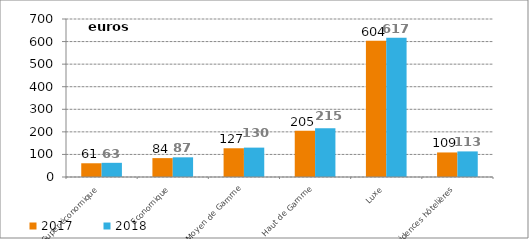
| Category | 2017 | 2018 |
|---|---|---|
| Super-économique | 60.841 | 62.845 |
| Economique | 83.625 | 87.161 |
| Moyen de Gamme | 127.298 | 130.15 |
| Haut de Gamme | 205.208 | 215.496 |
| Luxe | 604.141 | 616.678 |
| Résidences hôtelières | 108.715 | 113.377 |